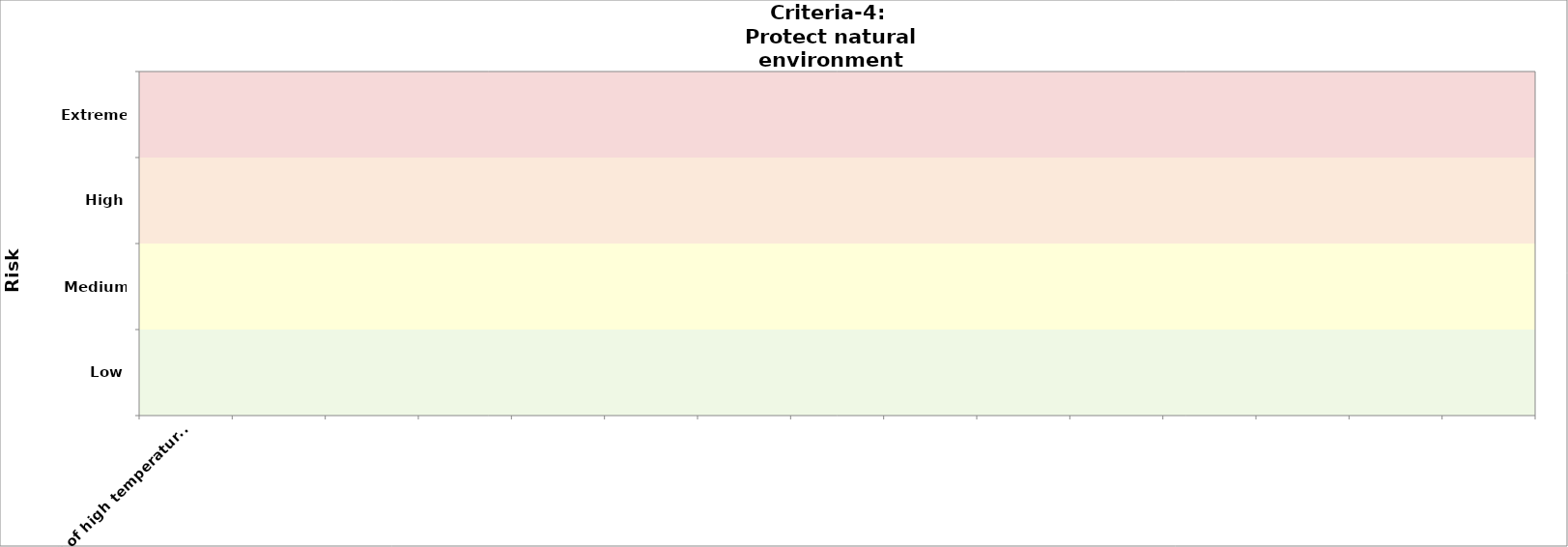
| Category | Criteria-3 (public health) | Criteria-4 
2030 |
|---|---|---|
| e.g. effect of high temperature on road pavement  |  | 0 |